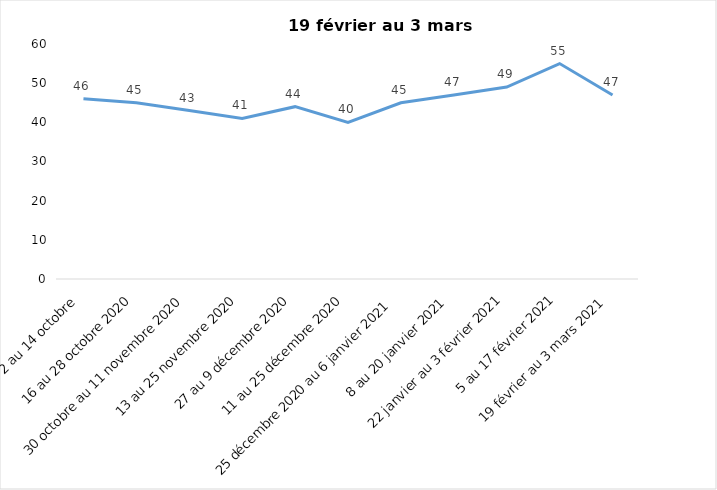
| Category | Toujours aux trois mesures |
|---|---|
| 2 au 14 octobre  | 46 |
| 16 au 28 octobre 2020 | 45 |
| 30 octobre au 11 novembre 2020 | 43 |
| 13 au 25 novembre 2020 | 41 |
| 27 au 9 décembre 2020 | 44 |
| 11 au 25 décembre 2020 | 40 |
| 25 décembre 2020 au 6 janvier 2021 | 45 |
| 8 au 20 janvier 2021 | 47 |
| 22 janvier au 3 février 2021 | 49 |
| 5 au 17 février 2021 | 55 |
| 19 février au 3 mars 2021 | 47 |